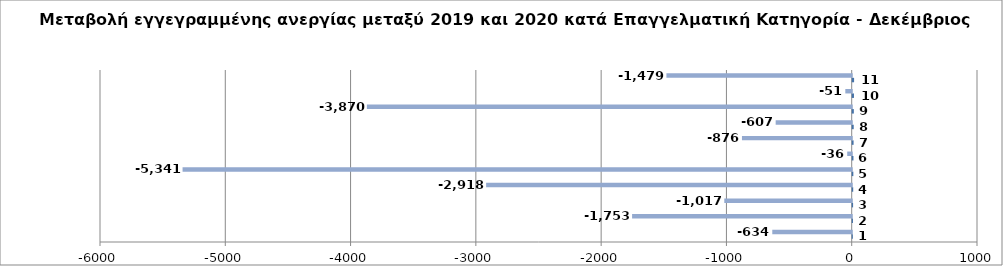
| Category | Series 0 | Series 1 |
|---|---|---|
| 0 | 1 | -634 |
| 1 | 2 | -1753 |
| 2 | 3 | -1017 |
| 3 | 4 | -2918 |
| 4 | 5 | -5341 |
| 5 | 6 | -36 |
| 6 | 7 | -876 |
| 7 | 8 | -607 |
| 8 | 9 | -3870 |
| 9 | 10 | -51 |
| 10 | 11 | -1479 |